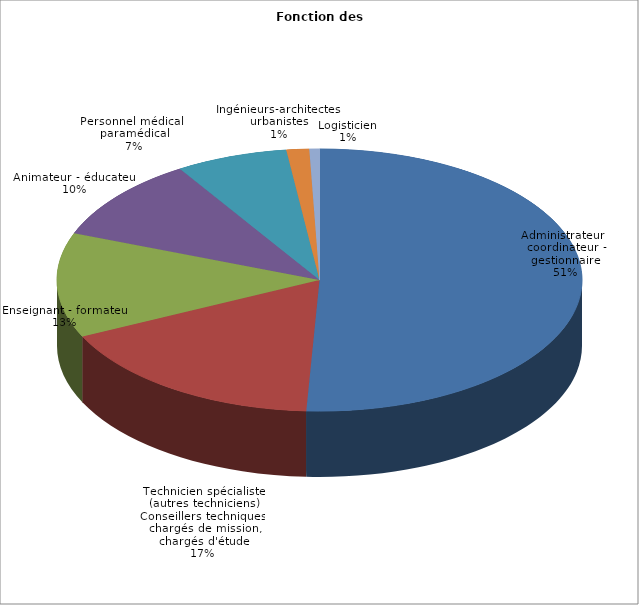
| Category | Nombre de volontaires | % |
|---|---|---|
| Administrateur - coordinateur - gestionnaire | 980 | 0.508 |
| Technicien spécialiste (autres techniciens)
Conseillers techniques, chargés de mission, chargés d'étude | 330 | 0.171 |
| Enseignant - formateur | 249 | 0.129 |
| Animateur - éducateur | 198 | 0.103 |
| Personnel médical - paramédical | 133 | 0.069 |
| Ingénieurs-architectes-urbanistes | 27 | 0.014 |
| Logisticien | 12 | 0.006 |